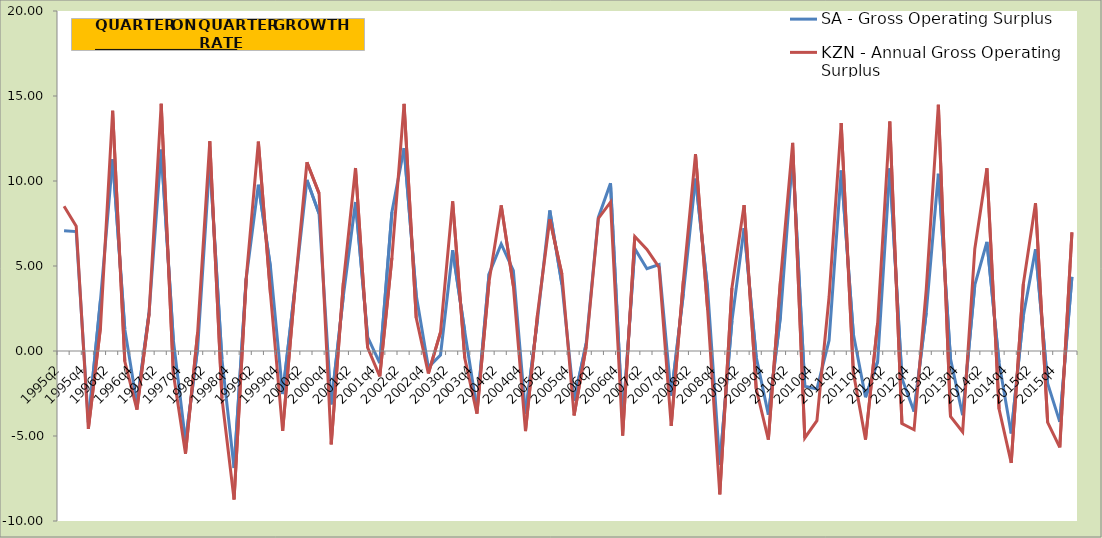
| Category | SA - Gross Operating Surplus | KZN - Annual Gross Operating Surplus |
|---|---|---|
| 1995q2 | 7.068 | 8.518 |
| 1995q3 | 7.027 | 7.342 |
| 1995q4 | -4.193 | -4.576 |
| 1996q1 | 3.012 | 1.392 |
| 1996q2 | 11.285 | 14.13 |
| 1996q3 | 1.284 | -0.608 |
| 1996q4 | -3.118 | -3.449 |
| 1997q1 | 2.259 | 2.172 |
| 1997q2 | 11.844 | 14.545 |
| 1997q3 | 0.641 | -1.33 |
| 1997q4 | -5.309 | -6.038 |
| 1998q1 | 0.153 | 1.099 |
| 1998q2 | 11.183 | 12.339 |
| 1998q3 | -0.495 | -2.772 |
| 1998q4 | -6.881 | -8.734 |
| 1999q1 | 4.278 | 4.26 |
| 1999q2 | 9.776 | 12.323 |
| 1999q3 | 4.934 | 3.343 |
| 1999q4 | -2.531 | -4.702 |
| 2000q1 | 3.631 | 3.569 |
| 2000q2 | 10.063 | 11.104 |
| 2000q3 | 8.071 | 9.272 |
| 2000q4 | -3.137 | -5.49 |
| 2001q1 | 3.251 | 4.002 |
| 2001q2 | 8.763 | 10.764 |
| 2001q3 | 0.82 | 0.196 |
| 2001q4 | -0.715 | -1.493 |
| 2002q1 | 8.177 | 5.492 |
| 2002q2 | 11.933 | 14.537 |
| 2002q3 | 3.275 | 1.947 |
| 2002q4 | -0.962 | -1.326 |
| 2003q1 | -0.235 | 1.098 |
| 2003q2 | 5.927 | 8.804 |
| 2003q3 | 1.135 | -0.426 |
| 2003q4 | -3.427 | -3.68 |
| 2004q1 | 4.531 | 4.091 |
| 2004q2 | 6.298 | 8.565 |
| 2004q3 | 4.731 | 3.826 |
| 2004q4 | -3.691 | -4.708 |
| 2005q1 | 1.917 | 2.222 |
| 2005q2 | 8.269 | 7.753 |
| 2005q3 | 3.915 | 4.504 |
| 2005q4 | -2.931 | -3.79 |
| 2006q1 | 0.449 | 0.268 |
| 2006q2 | 7.858 | 7.797 |
| 2006q3 | 9.868 | 8.753 |
| 2006q4 | -4.175 | -4.973 |
| 2007q1 | 6.019 | 6.736 |
| 2007q2 | 4.842 | 5.975 |
| 2007q3 | 5.086 | 4.922 |
| 2007q4 | -2.627 | -4.398 |
| 2008q1 | 3.378 | 4.128 |
| 2008q2 | 10.135 | 11.579 |
| 2008q3 | 3.619 | 2.423 |
| 2008q4 | -6.703 | -8.438 |
| 2009q1 | 1.766 | 3.706 |
| 2009q2 | 7.231 | 8.579 |
| 2009q3 | -0.355 | -2.223 |
| 2009q4 | -3.743 | -5.216 |
| 2010q1 | 2.048 | 4.158 |
| 2010q2 | 11.518 | 12.246 |
| 2010q3 | -2.072 | -5.115 |
| 2010q4 | -2.228 | -4.095 |
| 2011q1 | 0.624 | 3.175 |
| 2011q2 | 10.617 | 13.41 |
| 2011q3 | 0.993 | -1.273 |
| 2011q4 | -2.724 | -5.209 |
| 2012q1 | -0.617 | 1.641 |
| 2012q2 | 10.743 | 13.498 |
| 2012q3 | -1.618 | -4.274 |
| 2012q4 | -3.563 | -4.633 |
| 2013q1 | 2.25 | 3.589 |
| 2013q2 | 10.425 | 14.486 |
| 2013q3 | -0.463 | -3.845 |
| 2013q4 | -3.777 | -4.759 |
| 2014q1 | 3.874 | 6 |
| 2014q2 | 6.414 | 10.752 |
| 2014q3 | -0.689 | -3.419 |
| 2014q4 | -4.85 | -6.578 |
| 2015q1 | 2.071 | 3.952 |
| 2015q2 | 5.985 | 8.691 |
| 2015q3 | -1.914 | -4.198 |
| 2015q4 | -4.169 | -5.664 |
| 2016q1 | 4.363 | 6.981 |